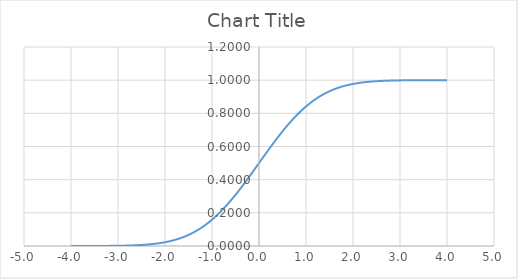
| Category | Series 0 |
|---|---|
| -4.0 | 0 |
| -3.9 | 0 |
| -3.8 | 0 |
| -3.7 | 0 |
| -3.6 | 0 |
| -3.5 | 0 |
| -3.4 | 0 |
| -3.3 | 0 |
| -3.2 | 0.001 |
| -3.1 | 0.001 |
| -3.0 | 0.001 |
| -2.9 | 0.002 |
| -2.8 | 0.003 |
| -2.7 | 0.003 |
| -2.6 | 0.005 |
| -2.5 | 0.006 |
| -2.4 | 0.008 |
| -2.3 | 0.011 |
| -2.2 | 0.014 |
| -2.1 | 0.018 |
| -2.0 | 0.023 |
| -1.9 | 0.029 |
| -1.8 | 0.036 |
| -1.7 | 0.045 |
| -1.6 | 0.055 |
| -1.5 | 0.067 |
| -1.4 | 0.081 |
| -1.3 | 0.097 |
| -1.2 | 0.115 |
| -1.1 | 0.136 |
| -1.0 | 0.159 |
| -0.9 | 0.184 |
| -0.8 | 0.212 |
| -0.7 | 0.242 |
| -0.6 | 0.274 |
| -0.5 | 0.309 |
| -0.4 | 0.345 |
| -0.3 | 0.382 |
| -0.2 | 0.421 |
| -0.1 | 0.46 |
| 0.0 | 0.5 |
| 0.0999999999999996 | 0.54 |
| 0.2 | 0.579 |
| 0.3 | 0.618 |
| 0.4 | 0.655 |
| 0.5 | 0.691 |
| 0.6 | 0.726 |
| 0.7 | 0.758 |
| 0.8 | 0.788 |
| 0.9 | 0.816 |
| 1.0 | 0.841 |
| 1.1 | 0.864 |
| 1.2 | 0.885 |
| 1.3 | 0.903 |
| 1.4 | 0.919 |
| 1.50000000000001 | 0.933 |
| 1.6 | 0.945 |
| 1.7 | 0.955 |
| 1.80000000000001 | 0.964 |
| 1.90000000000001 | 0.971 |
| 2.00000000000001 | 0.977 |
| 2.1 | 0.982 |
| 2.20000000000001 | 0.986 |
| 2.30000000000001 | 0.989 |
| 2.40000000000001 | 0.992 |
| 2.50000000000001 | 0.994 |
| 2.60000000000001 | 0.995 |
| 2.70000000000001 | 0.997 |
| 2.80000000000001 | 0.997 |
| 2.90000000000001 | 0.998 |
| 3.00000000000001 | 0.999 |
| 3.10000000000001 | 0.999 |
| 3.20000000000001 | 0.999 |
| 3.30000000000001 | 1 |
| 3.40000000000001 | 1 |
| 3.50000000000001 | 1 |
| 3.60000000000001 | 1 |
| 3.70000000000001 | 1 |
| 3.80000000000001 | 1 |
| 3.90000000000001 | 1 |
| 4.00000000000001 | 1 |